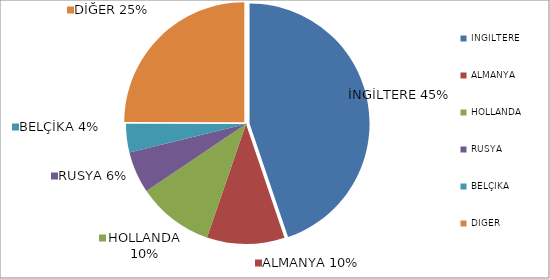
| Category | Series 0 |
|---|---|
| İNGİLTERE | 224391 |
| ALMANYA | 52444 |
| HOLLANDA | 51575 |
| RUSYA | 28091 |
| BELÇİKA | 19346 |
| DİĞER | 125002 |